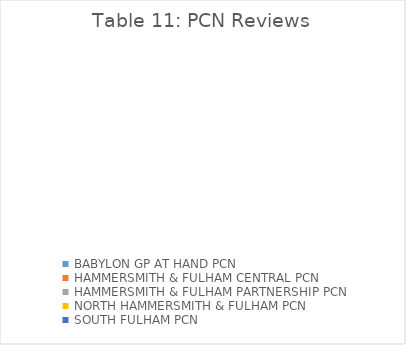
| Category | Series 0 |
|---|---|
| BABYLON GP AT HAND PCN | 0 |
| HAMMERSMITH & FULHAM CENTRAL PCN | 0 |
| HAMMERSMITH & FULHAM PARTNERSHIP PCN | 0 |
| NORTH HAMMERSMITH & FULHAM PCN | 0 |
| SOUTH FULHAM PCN | 0 |